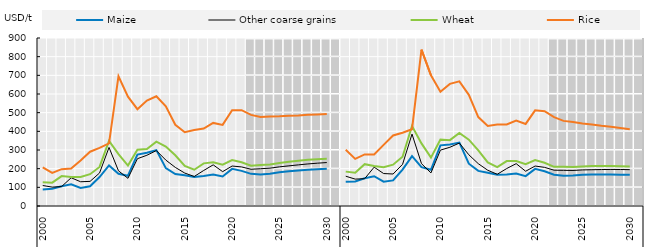
| Category | Projected1 | Projected2 | Projected3 | Projected4 | Projected5 | Projected6 | Projected7 | Projected8 | Projected9 |
|---|---|---|---|---|---|---|---|---|---|
| 0 | 0 | 0 | 0 | 0 | 0 | 0 | 0 | 0 | 0 |
| 1 | 0 | 0 | 0 | 0 | 0 | 0 | 0 | 0 | 0 |
| 2 | 0 | 0 | 0 | 0 | 0 | 0 | 0 | 0 | 0 |
| 3 | 0 | 0 | 0 | 0 | 0 | 0 | 0 | 0 | 0 |
| 4 | 0 | 0 | 0 | 0 | 0 | 0 | 0 | 0 | 0 |
| 5 | 0 | 0 | 0 | 0 | 0 | 0 | 0 | 0 | 0 |
| 6 | 0 | 0 | 0 | 0 | 0 | 0 | 0 | 0 | 0 |
| 7 | 0 | 0 | 0 | 0 | 0 | 0 | 0 | 0 | 0 |
| 8 | 0 | 0 | 0 | 0 | 0 | 0 | 0 | 0 | 0 |
| 9 | 0 | 0 | 0 | 0 | 0 | 0 | 0 | 0 | 0 |
| 10 | 0 | 0 | 0 | 0 | 0 | 0 | 0 | 0 | 0 |
| 11 | 0 | 0 | 0 | 0 | 0 | 0 | 0 | 0 | 0 |
| 12 | 0 | 0 | 0 | 0 | 0 | 0 | 0 | 0 | 0 |
| 13 | 0 | 0 | 0 | 0 | 0 | 0 | 0 | 0 | 0 |
| 14 | 0 | 0 | 0 | 0 | 0 | 0 | 0 | 0 | 0 |
| 15 | 0 | 0 | 0 | 0 | 0 | 0 | 0 | 0 | 0 |
| 16 | 0 | 0 | 0 | 0 | 0 | 0 | 0 | 0 | 0 |
| 17 | 0 | 0 | 0 | 0 | 0 | 0 | 0 | 0 | 0 |
| 18 | 0 | 0 | 0 | 0 | 0 | 0 | 0 | 0 | 0 |
| 19 | 0 | 0 | 0 | 0 | 0 | 0 | 0 | 0 | 0 |
| 20 | 0 | 0 | 0 | 0 | 0 | 0 | 0 | 0 | 0 |
| 21 | 0 | 0 | 0 | 0 | 0 | 0 | 0 | 0 | 0 |
| 22 | 1 | 1 | 1 | 1 | 1 | 1 | 1 | 1 | 0.95 |
| 23 | 1 | 1 | 1 | 1 | 1 | 1 | 1 | 1 | 0.95 |
| 24 | 1 | 1 | 1 | 1 | 1 | 1 | 1 | 1 | 0.95 |
| 25 | 1 | 1 | 1 | 1 | 1 | 1 | 1 | 1 | 0.95 |
| 26 | 1 | 1 | 1 | 1 | 1 | 1 | 1 | 1 | 0.95 |
| 27 | 1 | 1 | 1 | 1 | 1 | 1 | 1 | 1 | 0.95 |
| 28 | 1 | 1 | 1 | 1 | 1 | 1 | 1 | 1 | 0.95 |
| 29 | 1 | 1 | 1 | 1 | 1 | 1 | 1 | 1 | 0.95 |
| 30 | 1 | 1 | 1 | 1 | 1 | 1 | 1 | 1 | 0.95 |
| 31 | 1 | 1 | 1 | 1 | 1 | 1 | 1 | 1 | 0.95 |
| 32 | 0 | 0 | 0 | 0 | 0 | 0 | 0 | 0 | 0 |
| 33 | 0 | 0 | 0 | 0 | 0 | 0 | 0 | 0 | 0 |
| 34 | 0 | 0 | 0 | 0 | 0 | 0 | 0 | 0 | 0 |
| 35 | 0 | 0 | 0 | 0 | 0 | 0 | 0 | 0 | 0 |
| 36 | 0 | 0 | 0 | 0 | 0 | 0 | 0 | 0 | 0 |
| 37 | 0 | 0 | 0 | 0 | 0 | 0 | 0 | 0 | 0 |
| 38 | 0 | 0 | 0 | 0 | 0 | 0 | 0 | 0 | 0 |
| 39 | 0 | 0 | 0 | 0 | 0 | 0 | 0 | 0 | 0 |
| 40 | 0 | 0 | 0 | 0 | 0 | 0 | 0 | 0 | 0 |
| 41 | 0 | 0 | 0 | 0 | 0 | 0 | 0 | 0 | 0 |
| 42 | 0 | 0 | 0 | 0 | 0 | 0 | 0 | 0 | 0 |
| 43 | 0 | 0 | 0 | 0 | 0 | 0 | 0 | 0 | 0 |
| 44 | 0 | 0 | 0 | 0 | 0 | 0 | 0 | 0 | 0 |
| 45 | 0 | 0 | 0 | 0 | 0 | 0 | 0 | 0 | 0 |
| 46 | 0 | 0 | 0 | 0 | 0 | 0 | 0 | 0 | 0 |
| 47 | 0 | 0 | 0 | 0 | 0 | 0 | 0 | 0 | 0 |
| 48 | 0 | 0 | 0 | 0 | 0 | 0 | 0 | 0 | 0 |
| 49 | 0 | 0 | 0 | 0 | 0 | 0 | 0 | 0 | 0 |
| 50 | 0 | 0 | 0 | 0 | 0 | 0 | 0 | 0 | 0 |
| 51 | 0 | 0 | 0 | 0 | 0 | 0 | 0 | 0 | 0 |
| 52 | 0 | 0 | 0 | 0 | 0 | 0 | 0 | 0 | 0 |
| 53 | 0 | 0 | 0 | 0 | 0 | 0 | 0 | 0 | 0 |
| 54 | 1 | 1 | 1 | 1 | 1 | 1 | 1 | 1 | 0.95 |
| 55 | 1 | 1 | 1 | 1 | 1 | 1 | 1 | 1 | 0.95 |
| 56 | 1 | 1 | 1 | 1 | 1 | 1 | 1 | 1 | 0.95 |
| 57 | 1 | 1 | 1 | 1 | 1 | 1 | 1 | 1 | 0.95 |
| 58 | 1 | 1 | 1 | 1 | 1 | 1 | 1 | 1 | 0.95 |
| 59 | 1 | 1 | 1 | 1 | 1 | 1 | 1 | 1 | 0.95 |
| 60 | 1 | 1 | 1 | 1 | 1 | 1 | 1 | 1 | 0.95 |
| 61 | 1 | 1 | 1 | 1 | 1 | 1 | 1 | 1 | 0.95 |
| 62 | 1 | 1 | 1 | 1 | 1 | 1 | 1 | 1 | 0.95 |
| 63 | 1 | 1 | 1 | 1 | 1 | 1 | 1 | 1 | 0.95 |